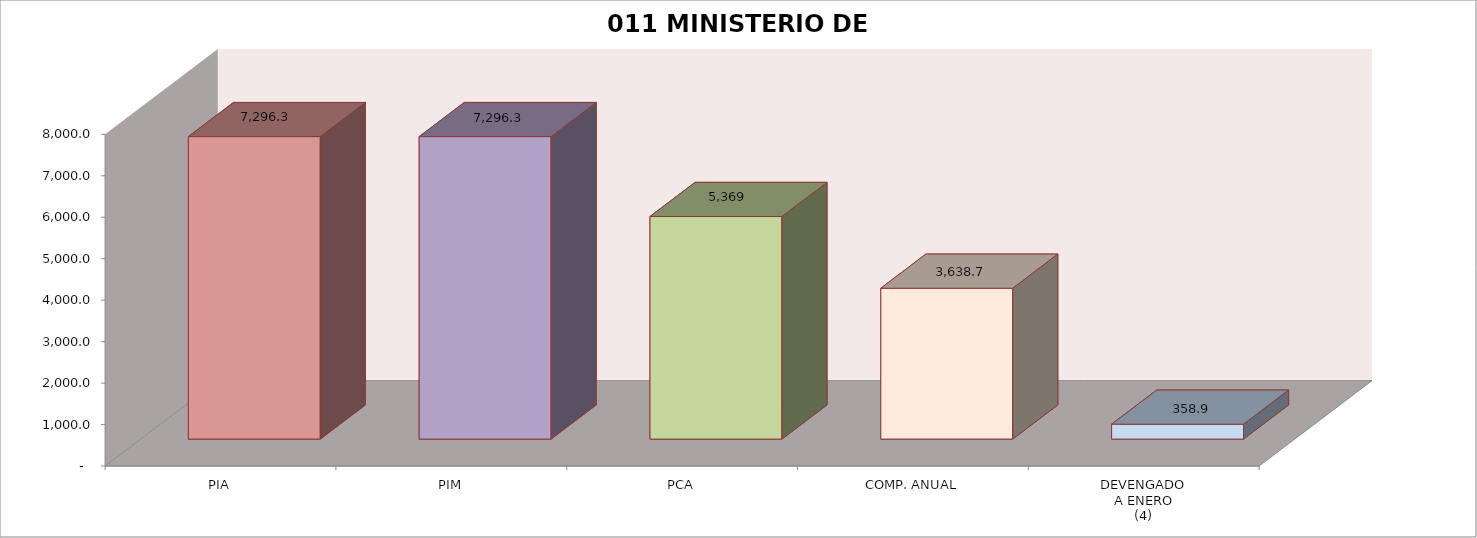
| Category | 011 MINISTERIO DE SALUD |
|---|---|
| PIA | 7296.309 |
| PIM | 7296.309 |
| PCA | 5369.234 |
| COMP. ANUAL | 3638.685 |
| DEVENGADO
A ENERO
(4) | 358.94 |